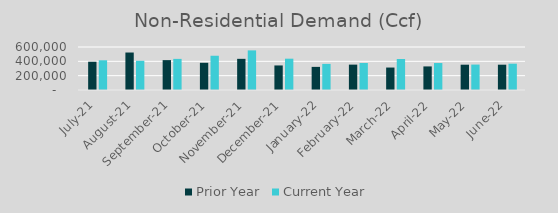
| Category | Prior Year | Current Year |
|---|---|---|
| 2021-07-01 | 394304.316 | 414577.112 |
| 2021-08-01 | 522963.473 | 407774.995 |
| 2021-09-01 | 416886.629 | 434192.442 |
| 2021-10-01 | 379515 | 477878.526 |
| 2021-11-01 | 434815 | 552599.698 |
| 2021-12-01 | 342584.594 | 436956.784 |
| 2022-01-01 | 322657.16 | 364164.019 |
| 2022-02-01 | 354041 | 377149.369 |
| 2022-03-01 | 313343 | 432270.798 |
| 2022-04-01 | 329084.722 | 376255.784 |
| 2022-05-01 | 353085 | 354792 |
| 2022-06-01 | 353141.442 | 367009.666 |